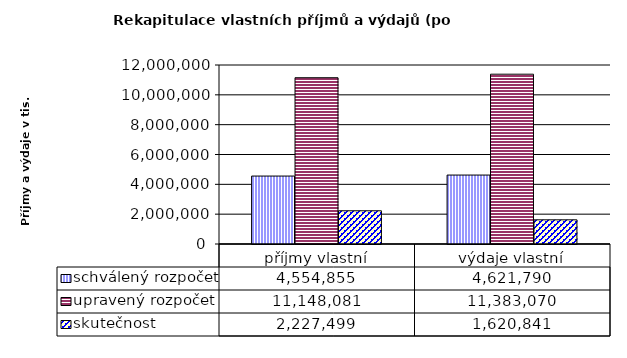
| Category | schválený rozpočet | upravený rozpočet | skutečnost |
|---|---|---|---|
| příjmy vlastní | 4554855 | 11148081 | 2227499 |
| výdaje vlastní | 4621790 | 11383070 | 1620841 |